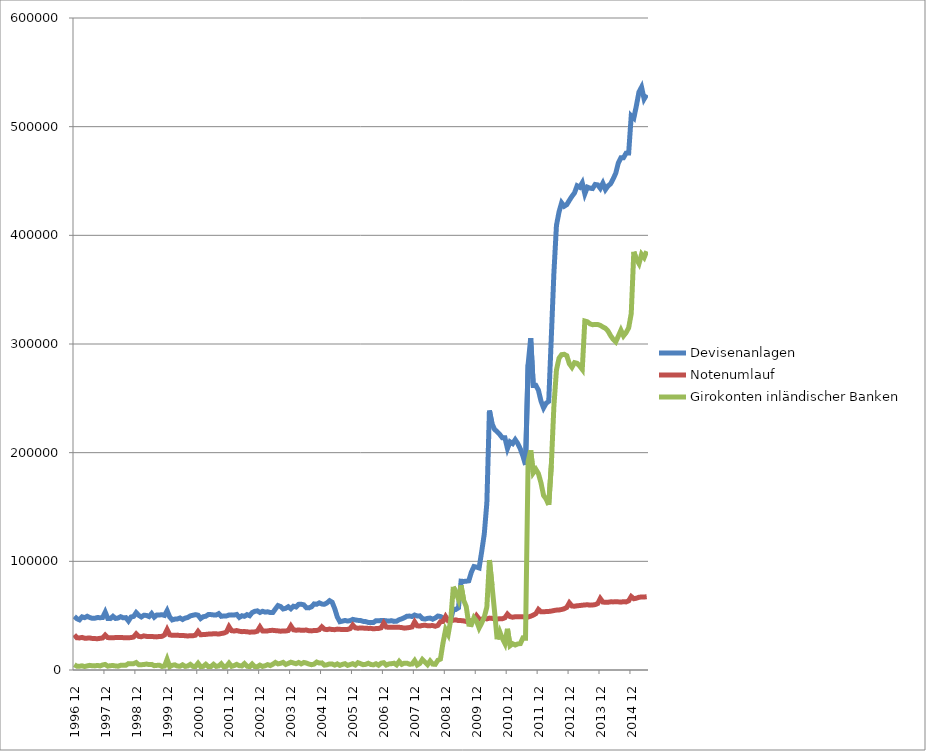
| Category | Devisenanlagen | Notenumlauf | Girokonten inländischer Banken |
|---|---|---|---|
| 1996-12-31 | 49328.4 | 32447.6 | 4927.383 |
| 1997-01-31 | 47263.3 | 29656 | 3493.574 |
| 1997-02-28 | 46147.1 | 29508.4 | 3456.774 |
| 1997-03-31 | 48885 | 29986.4 | 3853.682 |
| 1997-04-30 | 48188.3 | 29273.2 | 3185.989 |
| 1997-05-31 | 49430.7 | 29318.6 | 3772.923 |
| 1997-06-30 | 48304 | 29437.8 | 4249.072 |
| 1997-07-31 | 47545.3 | 29029 | 3895.579 |
| 1997-08-31 | 47643.5 | 28907.8 | 3784.346 |
| 1997-09-30 | 48313.6 | 28793.1 | 4227.645 |
| 1997-10-31 | 48107.5 | 29142 | 3740.129 |
| 1997-11-30 | 48326.9 | 29476.9 | 4635.561 |
| 1997-12-31 | 53270.6 | 32141.8 | 5100.849 |
| 1998-01-31 | 47405.8 | 29835.8 | 3526.75 |
| 1998-02-28 | 47294.2 | 29641.1 | 3975.844 |
| 1998-03-31 | 49400.4 | 29601.4 | 4110.25 |
| 1998-04-30 | 47410.5 | 29901.7 | 3730.847 |
| 1998-05-31 | 47804.3 | 29892.7 | 3487.073 |
| 1998-06-30 | 49036 | 30000.6 | 4344.775 |
| 1998-07-31 | 47989.5 | 29740.3 | 4254.145 |
| 1998-08-31 | 48194.6 | 29584.4 | 4379.663 |
| 1998-09-30 | 45138.3 | 29691.5 | 5842.388 |
| 1998-10-31 | 48817.8 | 29832 | 5639.128 |
| 1998-11-30 | 49300.3 | 30333.7 | 5828.325 |
| 1998-12-31 | 52805.7 | 33218.8 | 6860.139 |
| 1999-01-31 | 50297.3 | 30916.2 | 4880.54 |
| 1999-02-28 | 48823.4 | 30604.5 | 4906.595 |
| 1999-03-31 | 50415.5 | 31386.3 | 4997.382 |
| 1999-04-30 | 50201.2 | 30936.4 | 5517.582 |
| 1999-05-31 | 49162.1 | 30898.9 | 4966.168 |
| 1999-06-30 | 51930.8 | 30919.5 | 5148.522 |
| 1999-07-31 | 48597.1 | 30589.5 | 3976.204 |
| 1999-08-31 | 50633.3 | 30477.7 | 4238.967 |
| 1999-09-30 | 50641.8 | 30877.8 | 4431.312 |
| 1999-10-31 | 50851.5 | 30950.4 | 3258.47 |
| 1999-11-30 | 50216.2 | 32240.4 | 3598.598 |
| 1999-12-31 | 54608.2 | 37184.8 | 9883.338 |
| 2000-01-31 | 48824.6 | 32392.2 | 3046.459 |
| 2000-02-29 | 46080.6 | 31926.6 | 4361.662 |
| 2000-03-31 | 46833.3 | 32049.7 | 4721.643 |
| 2000-04-30 | 46988 | 32094 | 3591.322 |
| 2000-05-31 | 47874 | 31686.6 | 3517.865 |
| 2000-06-30 | 46470.4 | 31844 | 4774.206 |
| 2000-07-31 | 47759 | 31520 | 3304.723 |
| 2000-08-31 | 48323.3 | 31296.5 | 3706.037 |
| 2000-09-30 | 49783.4 | 31577.6 | 5179.791 |
| 2000-10-31 | 50382.3 | 31525.1 | 3327.076 |
| 2000-11-30 | 50925.9 | 32056.5 | 3281.816 |
| 2000-12-31 | 50452.8 | 35485.7 | 6193.6 |
| 2001-01-31 | 47351.779 | 32454.75 | 3093.253 |
| 2001-02-28 | 49032.467 | 32595.646 | 3317.905 |
| 2001-03-31 | 49456.317 | 32759.749 | 5263.871 |
| 2001-04-30 | 51072.714 | 33031.351 | 3101.621 |
| 2001-05-31 | 50967.777 | 33019.334 | 3193.412 |
| 2001-06-30 | 50673.978 | 33405.639 | 5232.698 |
| 2001-07-31 | 50590.909 | 33301.992 | 3321.134 |
| 2001-08-31 | 51848.903 | 33104.149 | 3709.919 |
| 2001-09-30 | 49403.142 | 33583.742 | 5744.969 |
| 2001-10-31 | 49716.657 | 33961.962 | 2888.01 |
| 2001-11-30 | 49751.269 | 34980.152 | 3375.445 |
| 2001-12-31 | 50580.836 | 39844.689 | 6316.924 |
| 2002-01-31 | 50729.475 | 36188.196 | 3396.638 |
| 2002-02-28 | 50575.08 | 35875.684 | 4073.571 |
| 2002-03-31 | 51130.605 | 36310.91 | 5180.743 |
| 2002-04-30 | 48402.592 | 35668.617 | 3892.726 |
| 2002-05-31 | 49940.572 | 35297.237 | 3737.525 |
| 2002-06-30 | 49408.949 | 35360.223 | 5926.235 |
| 2002-07-31 | 50973.269 | 35226.182 | 3459.074 |
| 2002-08-31 | 49968.818 | 34778.016 | 3103.044 |
| 2002-09-30 | 52866.977 | 34967.793 | 5497.126 |
| 2002-10-31 | 53990.556 | 35050.773 | 3161.917 |
| 2002-11-30 | 54414.2 | 35701.331 | 2945.72 |
| 2002-12-31 | 52941.185 | 39600.209 | 4516.905 |
| 2003-01-31 | 54014.105 | 35973.996 | 3299.132 |
| 2003-02-28 | 53270.524 | 35846.427 | 3886.712 |
| 2003-03-31 | 53577.684 | 35991.833 | 4940.139 |
| 2003-04-30 | 52860.496 | 36425.928 | 4097.166 |
| 2003-05-31 | 52869.111 | 36496.649 | 5291.259 |
| 2003-06-30 | 56197.941 | 36227.781 | 6942.636 |
| 2003-07-31 | 59286.924 | 36018.585 | 5632.384 |
| 2003-08-31 | 58415.334 | 35703.534 | 6145.829 |
| 2003-09-30 | 56167.115 | 35948.358 | 7015.954 |
| 2003-10-31 | 56777.946 | 35910.104 | 5118.507 |
| 2003-11-30 | 58224.819 | 36337.276 | 6064.991 |
| 2003-12-31 | 56311.73 | 40543.99 | 7186.622 |
| 2004-01-31 | 58661.646 | 36993.367 | 6440.064 |
| 2004-02-29 | 58004.247 | 36610.015 | 5770.036 |
| 2004-03-31 | 60401.518 | 36805.289 | 6930.414 |
| 2004-04-30 | 60521.174 | 36611.036 | 5644.036 |
| 2004-05-31 | 59985.41 | 36637.289 | 6909.605 |
| 2004-06-30 | 57274.603 | 36748.708 | 6416.927 |
| 2004-07-31 | 57172.847 | 36143.562 | 5470.832 |
| 2004-08-31 | 58154.873 | 35986.272 | 4875.71 |
| 2004-09-30 | 60798.37 | 36367.518 | 5398.998 |
| 2004-10-31 | 60467.203 | 36354.188 | 7306.725 |
| 2004-11-30 | 61765.74 | 37078.514 | 6384.321 |
| 2004-12-31 | 60708.025 | 39719.258 | 6541.684 |
| 2005-01-31 | 60454.398 | 37566.243 | 4474.869 |
| 2005-02-28 | 61716.338 | 37165.968 | 4792.789 |
| 2005-03-31 | 63786.219 | 37713.857 | 5604.327 |
| 2005-04-30 | 62371.442 | 37204.064 | 5504.936 |
| 2005-05-31 | 56529.87 | 37120.111 | 4493.622 |
| 2005-06-30 | 48793.622 | 37628.702 | 5625.627 |
| 2005-07-31 | 44452.377 | 37429.352 | 4263.588 |
| 2005-08-31 | 44983.078 | 37170.176 | 5184.897 |
| 2005-09-30 | 45583.756 | 37194.775 | 5784.656 |
| 2005-10-31 | 45047.806 | 37345.063 | 4263.98 |
| 2005-11-30 | 45428.664 | 38110.637 | 5047.949 |
| 2005-12-31 | 46585.457 | 41366.541 | 5852.687 |
| 2006-01-31 | 46068.025 | 38807.351 | 4599.605 |
| 2006-02-28 | 45665.959 | 38441.093 | 6709.687 |
| 2006-03-31 | 45552.748 | 38715.522 | 5851.418 |
| 2006-04-30 | 44755.508 | 38568.042 | 4907.301 |
| 2006-05-31 | 44539.256 | 38374.402 | 5180.223 |
| 2006-06-30 | 43785.353 | 38293.136 | 6209.781 |
| 2006-07-31 | 43614.466 | 38314.998 | 5097.867 |
| 2006-08-31 | 43671.088 | 37886.875 | 4737.913 |
| 2006-09-30 | 45400.007 | 38134.343 | 5748.677 |
| 2006-10-31 | 45309.204 | 38214.277 | 4387.47 |
| 2006-11-30 | 45557.721 | 38818.936 | 6269.812 |
| 2006-12-31 | 45591.921 | 43182.245 | 6715.954 |
| 2007-01-31 | 45284.992 | 39538.28 | 4538.346 |
| 2007-02-28 | 44976.48 | 39246.351 | 5582.681 |
| 2007-03-31 | 45398.114 | 39381.466 | 5815.257 |
| 2007-04-30 | 44733.354 | 39440.161 | 6244.955 |
| 2007-05-31 | 44908.54 | 39264.354 | 4692.469 |
| 2007-06-30 | 46274.065 | 39306.622 | 7906.555 |
| 2007-07-31 | 47095.406 | 39022.285 | 5237.563 |
| 2007-08-31 | 48124.912 | 38535.133 | 6312.871 |
| 2007-09-30 | 49487.113 | 38787.772 | 6319.973 |
| 2007-10-31 | 49623.105 | 39082.998 | 5317.345 |
| 2007-11-30 | 49201.897 | 39638.972 | 5475.498 |
| 2007-12-31 | 50586.261 | 44258.598 | 8672.908 |
| 2008-01-31 | 49729.006 | 40665.256 | 4556.32 |
| 2008-02-29 | 49810.141 | 40406.018 | 5987.633 |
| 2008-03-31 | 47295.683 | 40997.838 | 9674.382 |
| 2008-04-30 | 46843.318 | 41181.784 | 7364.484 |
| 2008-05-31 | 47494.514 | 40758.362 | 4908.163 |
| 2008-06-30 | 47778.621 | 40789.582 | 8280.959 |
| 2008-07-31 | 46725.303 | 40919.055 | 5411.12 |
| 2008-08-31 | 47866.581 | 40236.883 | 5221.339 |
| 2008-09-30 | 49664.882 | 41065.386 | 8917.209 |
| 2008-10-31 | 49246.764 | 44442.759 | 10061.556 |
| 2008-11-30 | 47939.361 | 44678.392 | 24957.83 |
| 2008-12-31 | 47428.755 | 49160.829 | 37186.187 |
| 2009-01-31 | 46451.529 | 45334.204 | 32778.665 |
| 2009-02-28 | 46470.092 | 45599.539 | 46098.282 |
| 2009-03-31 | 55846.187 | 45830.964 | 76557.961 |
| 2009-04-30 | 55764.499 | 46141.096 | 71315.341 |
| 2009-05-31 | 57284.683 | 45467.869 | 65019.918 |
| 2009-06-30 | 81706.316 | 45460.769 | 77836.98 |
| 2009-07-31 | 81485.163 | 45192.746 | 64252.497 |
| 2009-08-31 | 81705.705 | 44664.686 | 58456.647 |
| 2009-09-30 | 82105.194 | 45141.528 | 42062.516 |
| 2009-10-31 | 90061.345 | 45324.188 | 41726.786 |
| 2009-11-30 | 95202.842 | 45919.943 | 48136.712 |
| 2009-12-31 | 94680.215 | 49966.191 | 44992.946 |
| 2010-01-31 | 93894.825 | 46968.551 | 38609.444 |
| 2010-02-28 | 108929.837 | 46564.284 | 43267.806 |
| 2010-03-31 | 125088.591 | 47909.119 | 48632.405 |
| 2010-04-30 | 153581.597 | 47033.825 | 57865.466 |
| 2010-05-31 | 238786.446 | 47729.053 | 101111.38 |
| 2010-06-30 | 226657.739 | 47509.338 | 77838.982 |
| 2010-07-31 | 221375.364 | 47171.027 | 53705.154 |
| 2010-08-31 | 219300.407 | 46974.922 | 28269.54 |
| 2010-09-30 | 216822.523 | 47118.095 | 35277.246 |
| 2010-10-31 | 213725.459 | 47167.403 | 29066.44 |
| 2010-11-30 | 213774.521 | 48051.144 | 24402.126 |
| 2010-12-31 | 203809.644 | 51498 | 37950.724 |
| 2011-01-31 | 209902.764 | 49128.477 | 22322.795 |
| 2011-02-28 | 208326.086 | 48575.109 | 24160.757 |
| 2011-03-31 | 211918.051 | 49002.802 | 23076.39 |
| 2011-04-30 | 208396.218 | 48995.059 | 24041.747 |
| 2011-05-31 | 203385.298 | 48949.92 | 24259.818 |
| 2011-06-30 | 196848.798 | 48939.684 | 29576.361 |
| 2011-07-31 | 188734.835 | 48680.545 | 29381.943 |
| 2011-08-31 | 280981.989 | 48747.859 | 191763.546 |
| 2011-09-30 | 305281.477 | 49485.677 | 202117.851 |
| 2011-10-31 | 261815.382 | 50523.008 | 181381.807 |
| 2011-11-30 | 261949.749 | 51848.119 | 184684.5 |
| 2011-12-31 | 257504.165 | 55728.88 | 180720.743 |
| 2012-01-31 | 247484.028 | 53586.733 | 172223.734 |
| 2012-02-29 | 241236.635 | 53546.712 | 160612.308 |
| 2012-03-31 | 245498.529 | 53791.312 | 157347.441 |
| 2012-04-30 | 247218.373 | 53906.451 | 151897.208 |
| 2012-05-31 | 306147.797 | 54217.767 | 188361.25 |
| 2012-06-30 | 365055.746 | 54733.594 | 242629.403 |
| 2012-07-31 | 409188.552 | 55116.079 | 276109.221 |
| 2012-08-31 | 421573.448 | 55257.128 | 286970.645 |
| 2012-09-30 | 429917.71 | 55684.381 | 290229.543 |
| 2012-10-31 | 426769.453 | 56351.992 | 290496.571 |
| 2012-11-30 | 428253.096 | 57587.424 | 289294.783 |
| 2012-12-31 | 432208.904 | 61801.376 | 281814.056 |
| 2013-01-31 | 435882.73 | 58917.35 | 278544.827 |
| 2013-02-28 | 439066.212 | 58678.055 | 282837.072 |
| 2013-03-31 | 445585.249 | 59119.638 | 282240.429 |
| 2013-04-30 | 444254.583 | 59306.96 | 279716.104 |
| 2013-05-31 | 448348.555 | 59624.662 | 276625.808 |
| 2013-06-30 | 438177.45 | 59863.257 | 321115.994 |
| 2013-07-31 | 444348.938 | 60052.76 | 320437.692 |
| 2013-08-31 | 443418.703 | 59689.244 | 318533.944 |
| 2013-09-30 | 443070.613 | 59810.426 | 317757.582 |
| 2013-10-31 | 446798.249 | 60160.385 | 317967.489 |
| 2013-11-30 | 446420.246 | 61157.828 | 317949.671 |
| 2013-12-31 | 443274.518 | 65766.36 | 317131.684 |
| 2014-01-31 | 447978.381 | 62532.764 | 315678.66 |
| 2014-02-28 | 442151.144 | 62294.273 | 314482.427 |
| 2014-03-31 | 445479.56 | 62357.097 | 311897.969 |
| 2014-04-30 | 447444.803 | 62727.088 | 307677.564 |
| 2014-05-31 | 451952.496 | 62675.096 | 304263.423 |
| 2014-06-30 | 457215.857 | 62775.037 | 301977.972 |
| 2014-07-31 | 466618.098 | 62705.206 | 307282.835 |
| 2014-08-31 | 471385.236 | 62455.932 | 312702.889 |
| 2014-09-30 | 471452.308 | 62897.022 | 307459.256 |
| 2014-10-31 | 475585.666 | 62657.529 | 310472.19 |
| 2014-11-30 | 475727.833 | 63648.14 | 314843.24 |
| 2014-12-31 | 510062.407 | 67595.809 | 328006.197 |
| 2015-01-31 | 507856.149 | 65593.245 | 384820.913 |
| 2015-02-28 | 519330.244 | 66088.429 | 377887.76 |
| 2015-03-31 | 531911.39 | 66897.037 | 373918.03 |
| 2015-04-30 | 536364.095 | 67227.31 | 382580.383 |
| 2015-05-31 | 525478.934 | 67170.407 | 379542.364 |
| 2015-06-30 | 529520.61 | 67436.699 | 385354.828 |